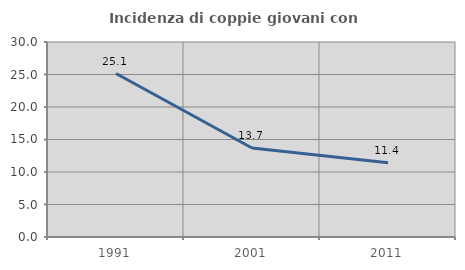
| Category | Incidenza di coppie giovani con figli |
|---|---|
| 1991.0 | 25.148 |
| 2001.0 | 13.699 |
| 2011.0 | 11.429 |